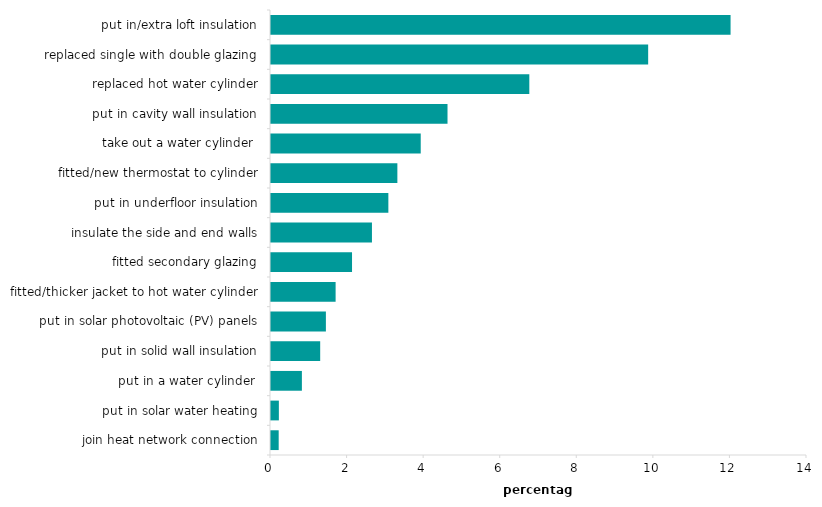
| Category | improvements made |
|---|---|
| put in/extra loft insulation | 12.03 |
| replaced single with double glazing | 9.877 |
| replaced hot water cylinder | 6.773 |
| put in cavity wall insulation | 4.637 |
| take out a water cylinder  | 3.937 |
| fitted/new thermostat to cylinder | 3.327 |
| put in underfloor insulation | 3.092 |
| insulate the side and end walls | 2.663 |
| fitted secondary glazing | 2.143 |
| fitted/thicker jacket to hot water cylinder | 1.714 |
| put in solar photovoltaic (PV) panels | 1.46 |
| put in solid wall insulation | 1.311 |
| put in a water cylinder  | 0.833 |
| put in solar water heating | 0.231 |
| join heat network connection | 0.227 |